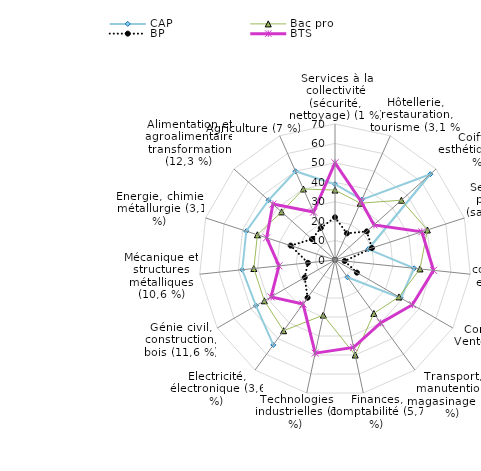
| Category | CAP | Bac pro | BP | BTS |
|---|---|---|---|---|
| Services à la collectivité (sécurité, nettoyage) (1 %) | 39 | 36 | 22 | 50 |
| Hôtellerie, restauration, tourisme (3,1 %) | 34 | 32 | 15 | 33 |
| Coiffure esthétique (4,4 %) | 66 | 46 | 22 | 27 |
| Services aux personnes (santé, social) (11,4 %) | 18 | 50 | 20 | 47 |
| Secrétariat, communication et information (4,6 %) | 41 | 44 | 5 | 51 |
| Commerce, Vente (17,8 %) | 39 | 38 | 13 | 46 |
| Transport, manutention, magasinage (2,2 %) | 11 | 34 | 0 | 40 |
| Finances, comptabilité (5,7 %) | 0 | 50 | 0 | 46 |
| Technologies industrielles (1 %) | 0 | 29 | 0 | 49 |
| Electricité, électronique (3,6 %) | 54 | 45 | 24 | 28 |
| Génie civil, construction, bois (11,6 %) | 47 | 42 | 18 | 38 |
| Mécanique et structures métalliques (10,6 %) | 48 | 42 | 14 | 29 |
| Energie, chimie, métallurgie (3,1 %) | 48 | 42 | 24 | 37 |
| Alimentation et agroalimentaire transformation (12,3 %) | 46 | 37 | 16 | 43 |
| Agriculture (7 %) | 50 | 40 | 18 | 27 |